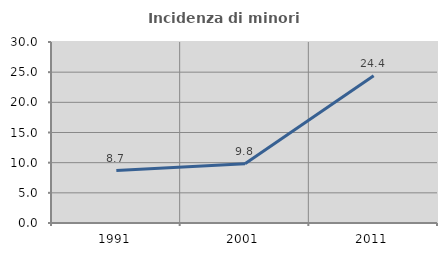
| Category | Incidenza di minori stranieri |
|---|---|
| 1991.0 | 8.696 |
| 2001.0 | 9.804 |
| 2011.0 | 24.424 |